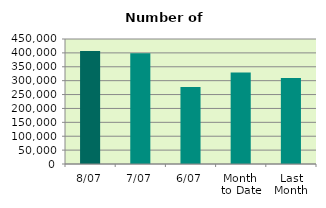
| Category | Series 0 |
|---|---|
| 8/07 | 406932 |
| 7/07 | 398846 |
| 6/07 | 277510 |
| Month 
to Date | 329620 |
| Last
Month | 309731.364 |